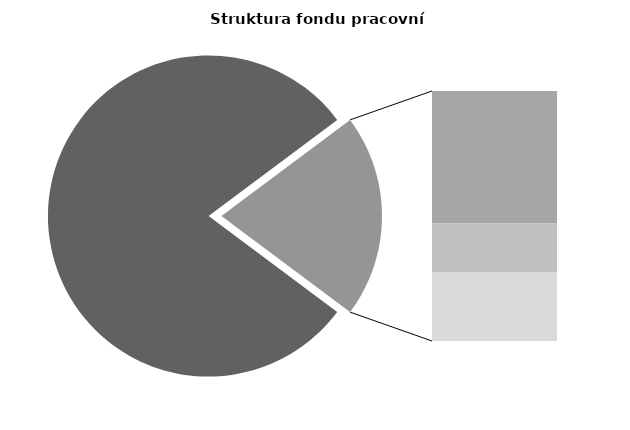
| Category | Series 0 |
|---|---|
| Průměrná měsíční odpracovaná doba bez přesčasu | 136.597 |
| Dovolená | 18.573 |
| Nemoc | 6.852 |
| Jiné | 9.64 |